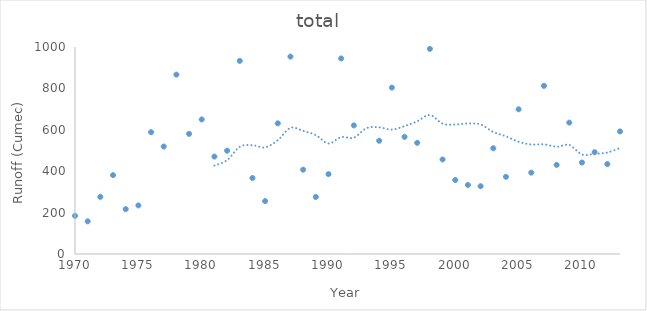
| Category | total  |
|---|---|
| 1970.0 | 184.31 |
| 1971.0 | 157.802 |
| 1972.0 | 276.097 |
| 1973.0 | 380.997 |
| 1974.0 | 216.653 |
| 1975.0 | 234.721 |
| 1976.0 | 588.36 |
| 1977.0 | 519.088 |
| 1978.0 | 866.61 |
| 1979.0 | 580.317 |
| 1980.0 | 649.986 |
| 1981.0 | 470.773 |
| 1982.0 | 499.15 |
| 1983.0 | 932.88 |
| 1984.0 | 367.134 |
| 1985.0 | 255.571 |
| 1986.0 | 631.181 |
| 1987.0 | 953.696 |
| 1988.0 | 407.21 |
| 1989.0 | 275.46 |
| 1990.0 | 385.877 |
| 1991.0 | 944.692 |
| 1992.0 | 621.395 |
| 1993.0 | 1021.181 |
| 1994.0 | 546.967 |
| 1995.0 | 803.93 |
| 1996.0 | 565.882 |
| 1997.0 | 537.083 |
| 1998.0 | 990.985 |
| 1999.0 | 456.825 |
| 2000.0 | 357.367 |
| 2001.0 | 333.542 |
| 2002.0 | 327.572 |
| 2003.0 | 510.875 |
| 2004.0 | 372.838 |
| 2005.0 | 699.066 |
| 2006.0 | 393.044 |
| 2007.0 | 812.349 |
| 2008.0 | 430.686 |
| 2009.0 | 634.632 |
| 2010.0 | 441.978 |
| 2011.0 | 491.796 |
| 2012.0 | 434.244 |
| 2013.0 | 592.106 |